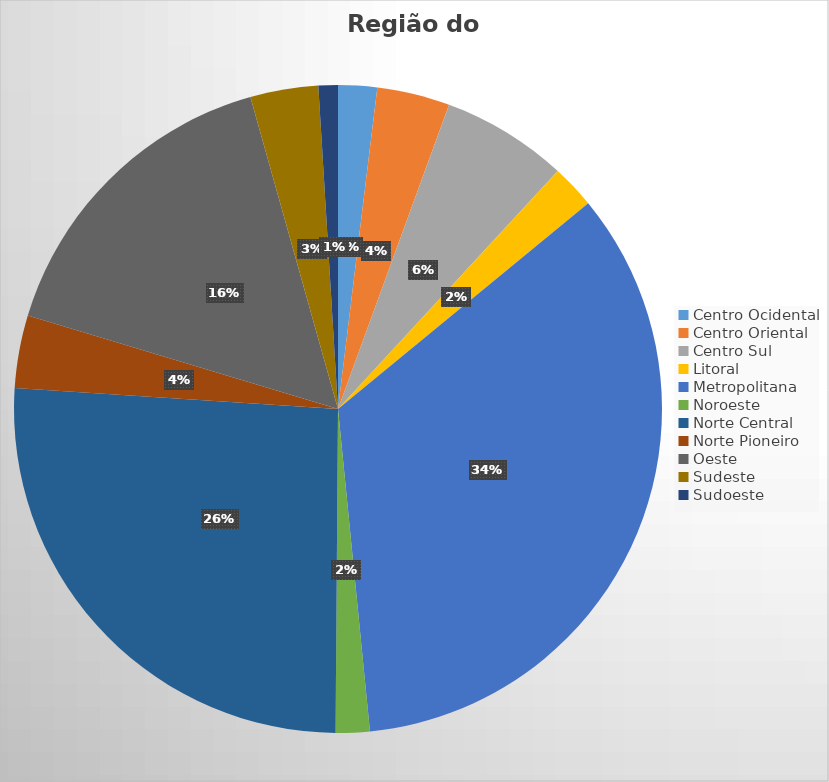
| Category | Series 0 |
|---|---|
| Centro Ocidental | 8 |
| Centro Oriental | 15 |
| Centro Sul | 26 |
| Litoral | 9 |
| Metropolitana  | 142 |
| Noroeste  | 7 |
| Norte Central  | 107 |
| Norte Pioneiro | 15 |
| Oeste | 66 |
| Sudeste | 14 |
| Sudoeste  | 4 |